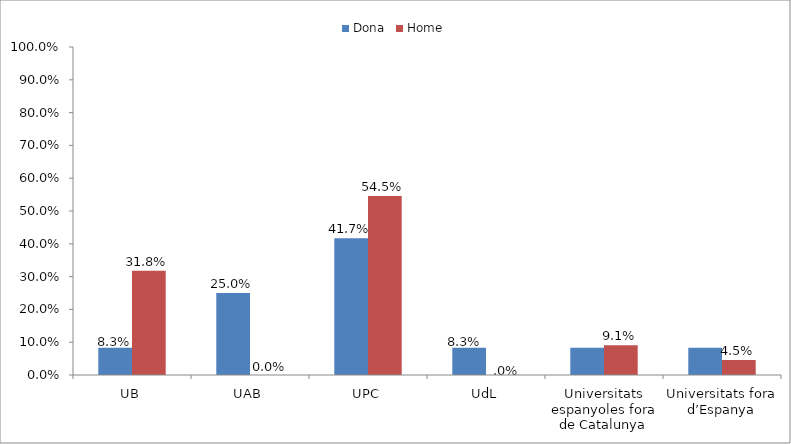
| Category | Dona | Home |
|---|---|---|
| UB | 0.083 | 0.318 |
| UAB | 0.25 | 0 |
| UPC | 0.417 | 0.545 |
| UdL | 0.083 | 0 |
| Universitats espanyoles fora de Catalunya | 0.083 | 0.091 |
| Universitats fora d’Espanya | 0.083 | 0.045 |